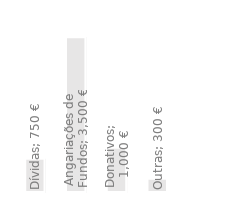
| Category | Receita Anual |
|---|---|
| Dívidas | 750 |
| Angariações de Fundos | 3500 |
| Donativos | 1000 |
| Outras | 300 |